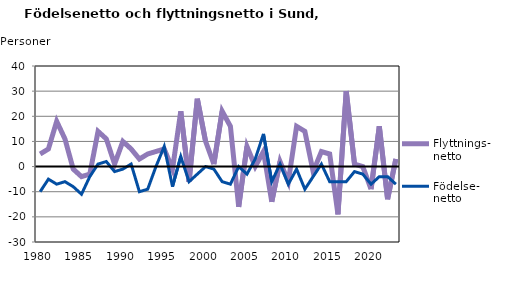
| Category | Flyttnings- netto | Födelse- netto |
|---|---|---|
| 1980.0 | 5 | -10 |
| 1981.0 | 7 | -5 |
| 1982.0 | 18 | -7 |
| 1983.0 | 11 | -6 |
| 1984.0 | -1 | -8 |
| 1985.0 | -4 | -11 |
| 1986.0 | -3 | -4 |
| 1987.0 | 14 | 1 |
| 1988.0 | 11 | 2 |
| 1989.0 | 1 | -2 |
| 1990.0 | 10 | -1 |
| 1991.0 | 7 | 1 |
| 1992.0 | 3 | -10 |
| 1993.0 | 5 | -9 |
| 1994.0 | 6 | 0 |
| 1995.0 | 7 | 8 |
| 1996.0 | -1 | -8 |
| 1997.0 | 22 | 4 |
| 1998.0 | -6 | -6 |
| 1999.0 | 27 | -3 |
| 2000.0 | 10 | 0 |
| 2001.0 | 1 | -1 |
| 2002.0 | 22 | -6 |
| 2003.0 | 16 | -7 |
| 2004.0 | -16 | 0 |
| 2005.0 | 8 | -3 |
| 2006.0 | 0 | 3 |
| 2007.0 | 6 | 13 |
| 2008.0 | -14 | -6 |
| 2009.0 | 2 | 1 |
| 2010.0 | -6 | -7 |
| 2011.0 | 16 | -1 |
| 2012.0 | 14 | -9 |
| 2013.0 | -2 | -4 |
| 2014.0 | 6 | 1 |
| 2015.0 | 5 | -6 |
| 2016.0 | -19 | -6 |
| 2017.0 | 30 | -6 |
| 2018.0 | 1 | -2 |
| 2019.0 | 0 | -3 |
| 2020.0 | -9 | -7 |
| 2021.0 | 16 | -4 |
| 2022.0 | -13 | -4 |
| 2023.0 | 3 | -7 |